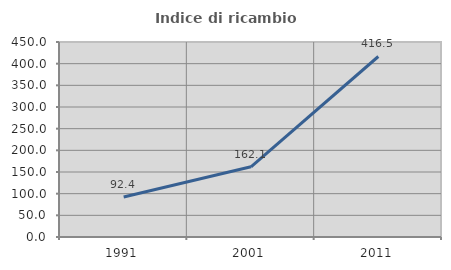
| Category | Indice di ricambio occupazionale  |
|---|---|
| 1991.0 | 92.442 |
| 2001.0 | 162.069 |
| 2011.0 | 416.541 |